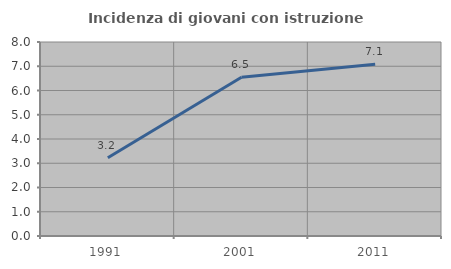
| Category | Incidenza di giovani con istruzione universitaria |
|---|---|
| 1991.0 | 3.226 |
| 2001.0 | 6.548 |
| 2011.0 | 7.087 |